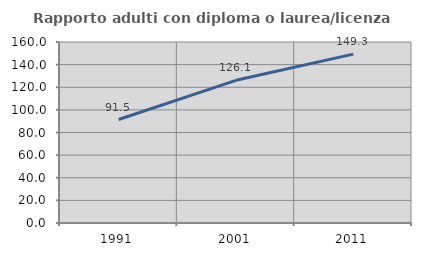
| Category | Rapporto adulti con diploma o laurea/licenza media  |
|---|---|
| 1991.0 | 91.473 |
| 2001.0 | 126.115 |
| 2011.0 | 149.254 |